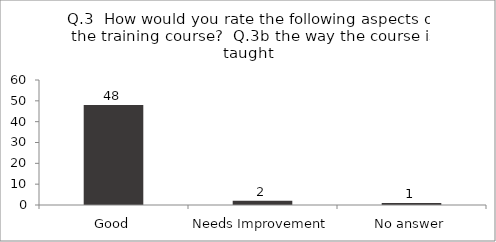
| Category | Q.3  How would you rate the following aspects of the training course?  |
|---|---|
| Good | 48 |
| Needs Improvement | 2 |
| No answer | 1 |